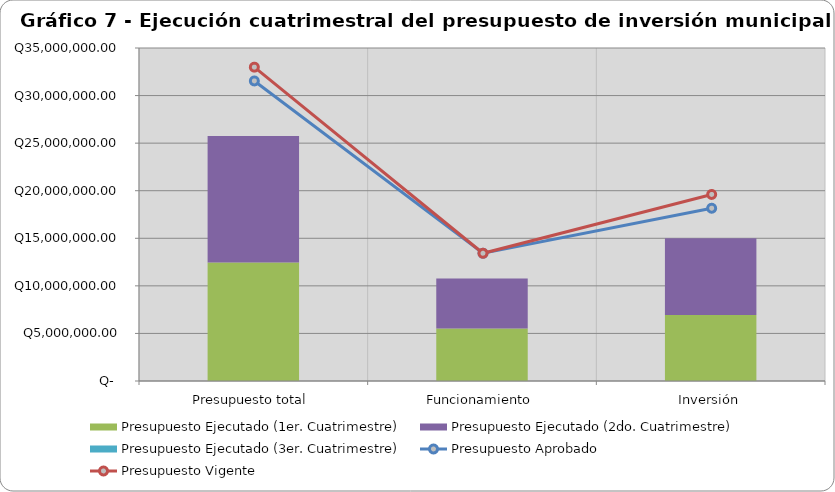
| Category | Presupuesto Ejecutado (1er. Cuatrimestre) | Presupuesto Ejecutado (2do. Cuatrimestre) | Presupuesto Ejecutado (3er. Cuatrimestre) |
|---|---|---|---|
| Presupuesto total | 12453209.17 | 13305701.25 | 0 |
| Funcionamiento | 5522218.54 | 5242010.61 | 0 |
| Inversión | 6930990.63 | 8063690.64 | 0 |